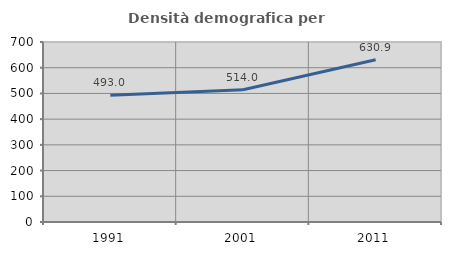
| Category | Densità demografica |
|---|---|
| 1991.0 | 493.005 |
| 2001.0 | 514.016 |
| 2011.0 | 630.861 |